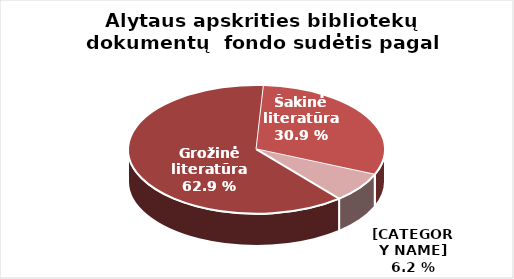
| Category | Series 0 |
|---|---|
| Grožinė literatūra* | 637948 |
| Šakinė literatūra* | 313882 |
| Periodiniai leidiniai | 76669 |